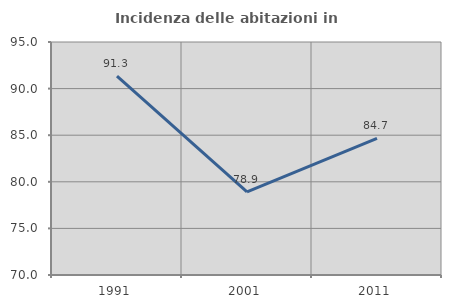
| Category | Incidenza delle abitazioni in proprietà  |
|---|---|
| 1991.0 | 91.339 |
| 2001.0 | 78.912 |
| 2011.0 | 84.663 |